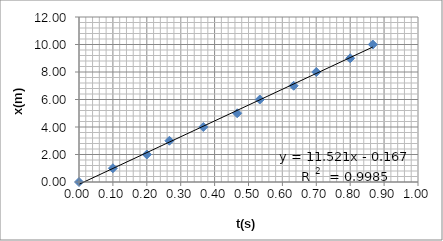
| Category | Series 0 |
|---|---|
| 0.0 | 0 |
| 0.1 | 1 |
| 0.2 | 2 |
| 0.26666666666666666 | 3 |
| 0.36666666666666664 | 4 |
| 0.4666666666666667 | 5 |
| 0.5333333333333333 | 6 |
| 0.6333333333333333 | 7 |
| 0.7 | 8 |
| 0.8 | 9 |
| 0.8666666666666667 | 10 |